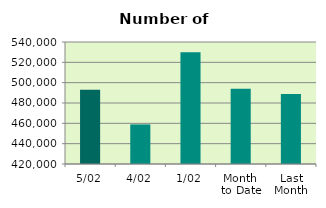
| Category | Series 0 |
|---|---|
| 5/02 | 492994 |
| 4/02 | 458940 |
| 1/02 | 530004 |
| Month 
to Date | 493979.333 |
| Last
Month | 488780.727 |